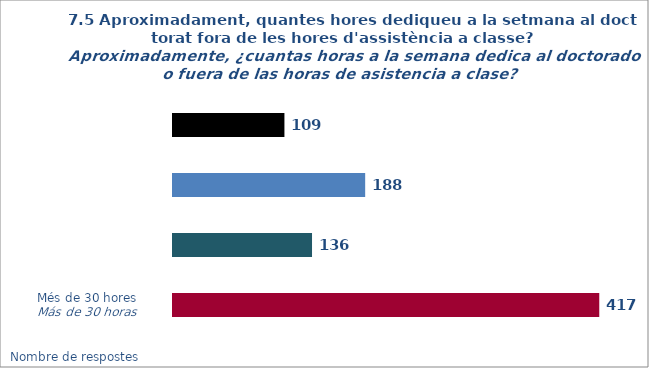
| Category | Series 0 |
|---|---|
| Menys de 10 | 109 |
| De 10 a 20 | 188 |
| De 20 a 30 | 136 |
| Mes de 30 | 417 |